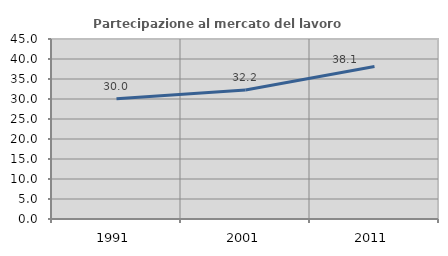
| Category | Partecipazione al mercato del lavoro  femminile |
|---|---|
| 1991.0 | 30.032 |
| 2001.0 | 32.248 |
| 2011.0 | 38.141 |